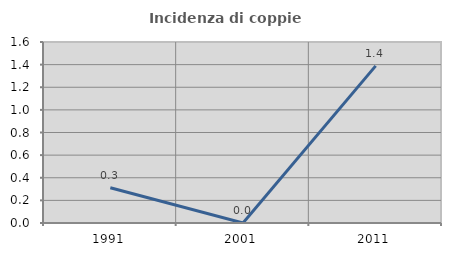
| Category | Incidenza di coppie miste |
|---|---|
| 1991.0 | 0.311 |
| 2001.0 | 0 |
| 2011.0 | 1.389 |